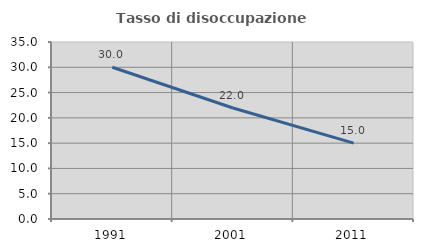
| Category | Tasso di disoccupazione giovanile  |
|---|---|
| 1991.0 | 30 |
| 2001.0 | 21.951 |
| 2011.0 | 15 |